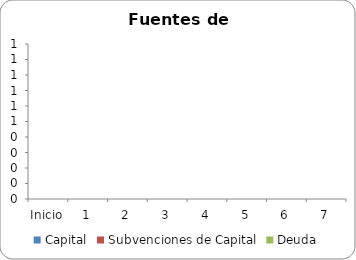
| Category | Capital | Subvenciones de Capital | Deuda |
|---|---|---|---|
| Inicio | 0 | 0 | 0 |
| 1 | 0 | 0 | 0 |
| 2 | 0 | 0 | 0 |
| 3 | 0 | 0 | 0 |
| 4 | 0 | 0 | 0 |
| 5 | 0 | 0 | 0 |
| 6 | 0 | 0 | 0 |
| 7 | 0 | 0 | 0 |